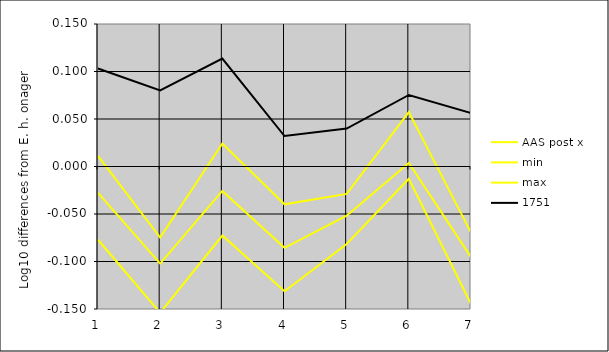
| Category | AAS post x | min | max | 1751 |
|---|---|---|---|---|
| 1.0 | -0.028 | -0.077 | 0.011 | 0.103 |
| 2.0 | -0.102 | -0.154 | -0.075 | 0.08 |
| 3.0 | -0.026 | -0.073 | 0.024 | 0.114 |
| 4.0 | -0.086 | -0.131 | -0.04 | 0.032 |
| 5.0 | -0.052 | -0.082 | -0.029 | 0.04 |
| 6.0 | 0.004 | -0.013 | 0.057 | 0.075 |
| 7.0 | -0.095 | -0.145 | -0.07 | 0.056 |